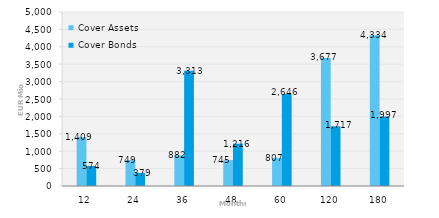
| Category | Cover Assets | Cover Bonds |
|---|---|---|
| 12.0 | 1409.173 | 573.874 |
| 24.0 | 748.928 | 378.566 |
| 36.0 | 881.679 | 3313 |
| 48.0 | 744.659 | 1216.181 |
| 60.0 | 807.309 | 2646.414 |
| 120.0 | 3677.403 | 1716.859 |
| 180.0 | 4333.702 | 1997.401 |